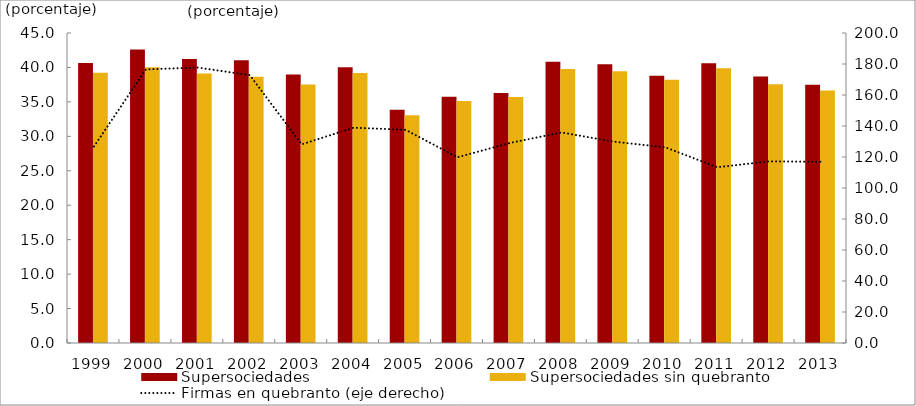
| Category | Supersociedades | Supersociedades sin quebranto |
|---|---|---|
| 1999.0 | 40.663 | 39.242 |
| 2000.0 | 42.606 | 40.044 |
| 2001.0 | 41.23 | 39.11 |
| 2002.0 | 41.053 | 38.637 |
| 2003.0 | 38.966 | 37.527 |
| 2004.0 | 40.022 | 39.2 |
| 2005.0 | 33.862 | 33.073 |
| 2006.0 | 35.75 | 35.135 |
| 2007.0 | 36.284 | 35.706 |
| 2008.0 | 40.818 | 39.785 |
| 2009.0 | 40.453 | 39.455 |
| 2010.0 | 38.787 | 38.217 |
| 2011.0 | 40.623 | 39.898 |
| 2012.0 | 38.694 | 37.572 |
| 2013.0 | 37.504 | 36.641 |